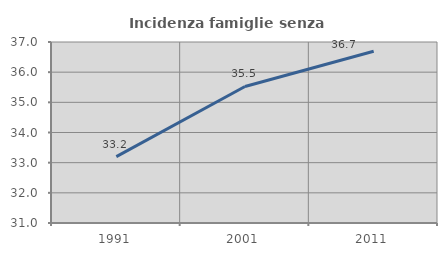
| Category | Incidenza famiglie senza nuclei |
|---|---|
| 1991.0 | 33.202 |
| 2001.0 | 35.526 |
| 2011.0 | 36.695 |